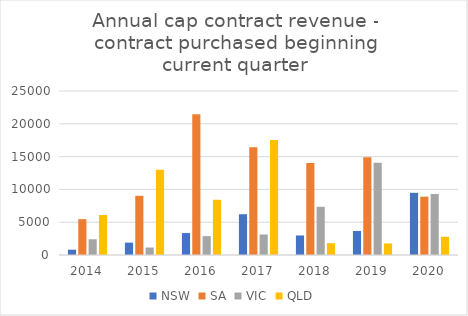
| Category | NSW | SA | VIC | QLD |
|---|---|---|---|---|
| 2014.0 | 809.298 | 5464.028 | 2398.201 | 6098.359 |
| 2015.0 | 1883.089 | 9022.41 | 1138.052 | 12989.058 |
| 2016.0 | 3345.261 | 21441.735 | 2876.52 | 8421.467 |
| 2017.0 | 6217.127 | 16409.457 | 3130.62 | 17520.865 |
| 2018.0 | 2978.396 | 14009.07 | 7349.395 | 1800.053 |
| 2019.0 | 3656.906 | 14893.732 | 14054.472 | 1763.856 |
| 2020.0 | 9480.728 | 8895.618 | 9303.715 | 2782.03 |